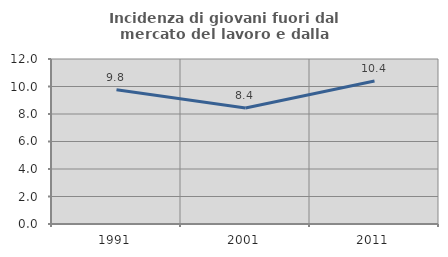
| Category | Incidenza di giovani fuori dal mercato del lavoro e dalla formazione  |
|---|---|
| 1991.0 | 9.756 |
| 2001.0 | 8.434 |
| 2011.0 | 10.405 |